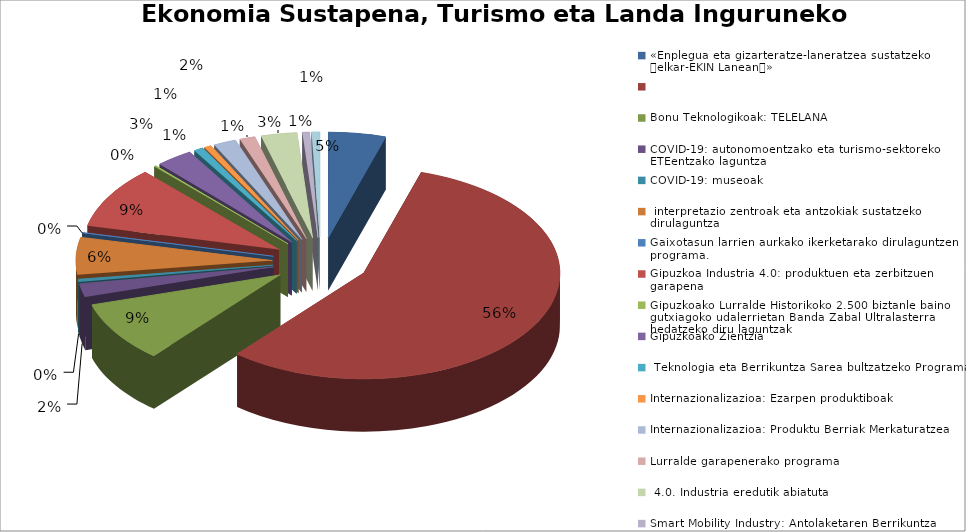
| Category |  Eskaerak | Ezetsiak | Emakida |
|---|---|---|---|
| «Enplegua eta gizarteratze-laneratzea sustatzeko elkar-EKIN Lanean», | 56 | 25 | 1200000 |
| Bonu Teknologikoak: TELELANA | 667 | 291 | 850000 |
| COVID-19: autonomoentzako eta turismo-sektoreko ETEentzako laguntza | 110 | 32 | 218024.2 |
| COVID-19: museoak, interpretazio zentroak eta antzokiak sustatzeko dirulaguntza | 24 | 2 | 30710.48 |
| Gaixotasun larrien aurkako ikerketarako dirulaguntzen programa. | 5 | 3 | 118336.16 |
| Gipuzkoa Industria 4.0: produktuen eta zerbitzuen garapena | 67 | 48 | 960000 |
| Gipuzkoako Lurralde Historikoko 2.500 biztanle baino gutxiagoko udalerrietan Banda Zabal Ultralasterra hedatzeko diru laguntzak | 1 | 0 | 2419843.95 |
| Gipuzkoako Zientzia, Teknologia eta Berrikuntza Sarea bultzatzeko Programa | 112 | 112 | 0 |
| Internazionalizazioa: Ezarpen produktiboak | 2 | 0 | 160000 |
| Internazionalizazioa: Produktu Berriak Merkaturatzea | 36 | 7 | 670000 |
| Lurralde garapenerako programa, 4.0. Industria eredutik abiatuta | 9 | 0 | 150000 |
| Smart Mobility Industry: Antolaketaren Berrikuntza | 7 | 0 | 92463 |
| Smart Mobility Industry: Produktuaren Berrikuntza | 22 | 9 | 431000 |
| Smart Mobility Industry: Proiektu Pilotoak | 15 | 8 | 276500 |
| Zibersegurtasuna: enpresak | 35 | 6 | 153058 |
| Zibersegurtasuna: I+G | 7 | 5 | 80000 |
| Zibersegurtasuna: Telelana | 8 | 4 | 54971 |